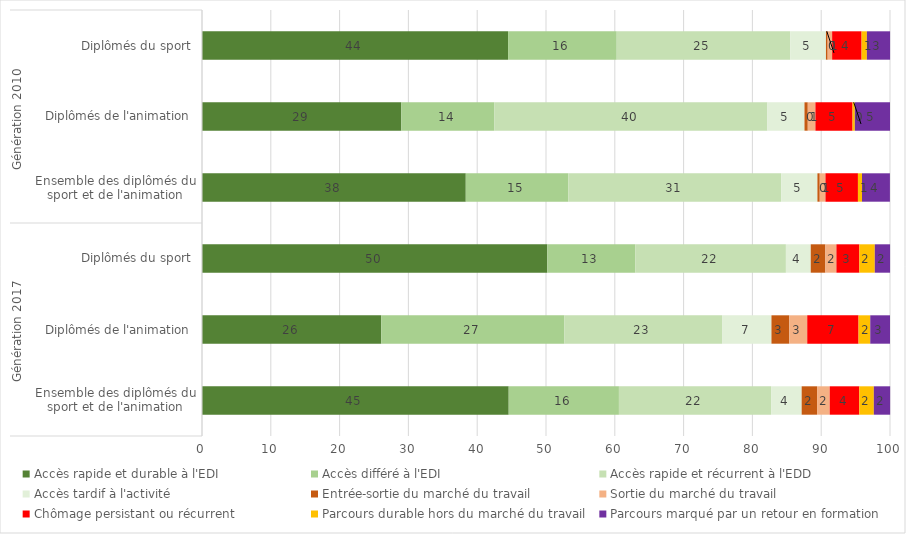
| Category | Accès rapide et durable à l'EDI | Accès différé à l'EDI | Accès rapide et récurrent à l'EDD | Accès tardif à l'activité | Entrée-sortie du marché du travail | Sortie du marché du travail | Chômage persistant ou récurrent | Parcours durable hors du marché du travail | Parcours marqué par un retour en formation |
|---|---|---|---|---|---|---|---|---|---|
| 0 | 44.58 | 16.02 | 22.12 | 4.44 | 2.24 | 1.84 | 4.3 | 2.11 | 2.37 |
| 1 | 26.06 | 26.62 | 22.91 | 7.18 | 2.6 | 2.6 | 7.46 | 1.7 | 2.87 |
| 2 | 50.19 | 12.8 | 21.88 | 3.61 | 2.13 | 1.6 | 3.34 | 2.24 | 2.22 |
| 3 | 38.34 | 14.9 | 30.94 | 5.27 | 0.34 | 0.83 | 4.72 | 0.59 | 4.06 |
| 4 | 28.97 | 13.53 | 39.68 | 5.39 | 0.48 | 1.11 | 5.4 | 0.33 | 5.11 |
| 5 | 44.49 | 15.79 | 25.21 | 5.2 | 0.25 | 0.65 | 4.28 | 0.77 | 3.37 |